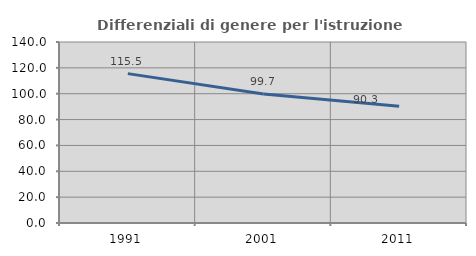
| Category | Differenziali di genere per l'istruzione superiore |
|---|---|
| 1991.0 | 115.536 |
| 2001.0 | 99.715 |
| 2011.0 | 90.282 |